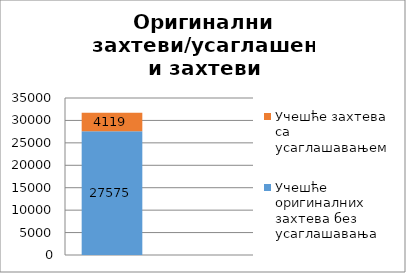
| Category | Учешће оригиналних захтева без усаглашавања | Учешће захтева са усаглашавањем |
|---|---|---|
| 0 | 27575 | 4119 |
| 1 | 0.87 | 0.13 |